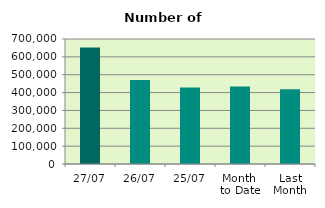
| Category | Series 0 |
|---|---|
| 27/07 | 652344 |
| 26/07 | 470596 |
| 25/07 | 428620 |
| Month 
to Date | 434303.579 |
| Last
Month | 418146.182 |